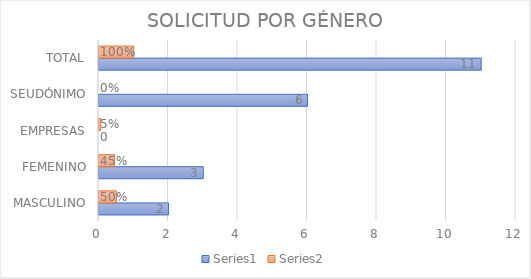
| Category | Series 0 | Series 1 |
|---|---|---|
| MASCULINO | 2 | 0.5 |
| FEMENINO | 3 | 0.45 |
| EMPRESAS | 0 | 0.05 |
| SEUDÓNIMO | 6 | 0 |
| TOTAL | 11 | 1 |